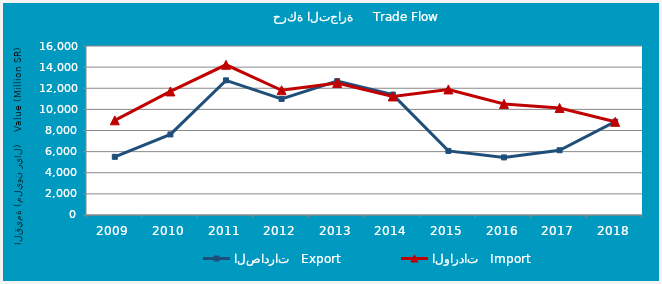
| Category | الصادرات   Export | الواردات   Import |
|---|---|---|
| 2009.0 | 5508543961 | 8963812123 |
| 2010.0 | 7626588777 | 11699085387 |
| 2011.0 | 12746047891 | 14222156190 |
| 2012.0 | 10987481103 | 11810326920 |
| 2013.0 | 12670243407 | 12499800335 |
| 2014.0 | 11399582551 | 11225087135 |
| 2015.0 | 6068885843 | 11888549918 |
| 2016.0 | 5451970930 | 10518070844 |
| 2017.0 | 6130326195 | 10135435827 |
| 2018.0 | 8839957313 | 8823565845 |